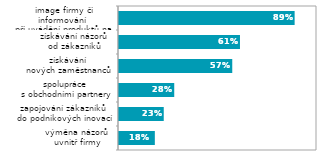
| Category | Series 0 |
|---|---|
| výměna názorů 
uvnitř firmy | 0.181 |
| zapojování zákazníků 
do podnikových inovací | 0.226 |
| spolupráce 
s obchodními partnery | 0.279 |
| získávání 
nových zaměstnanců | 0.572 |
| získávání názorů 
od zákazníků | 0.611 |
| image firmy či informování 
při uvádění produktů na trh | 0.887 |